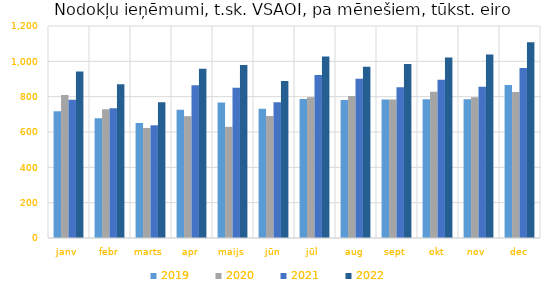
| Category | 2019 | 2020 | 2021 | 2022 |
|---|---|---|---|---|
| janv | 717665.072 | 809688.721 | 782986.001 | 941791.936 |
| febr | 677510.103 | 729172.133 | 734852.065 | 870814.989 |
| marts | 650253.135 | 622803.58 | 637891.51 | 769054.685 |
| apr | 726487.169 | 689512.187 | 864350.424 | 957835.152 |
| maijs | 766741.521 | 629295.897 | 850252.991 | 978678.559 |
| jūn | 731242 | 690672.482 | 768738.388 | 888916.233 |
| jūl | 786636.326 | 796698.852 | 922262.256 | 1027456.888 |
| aug | 780536.674 | 803951.557 | 901674.184 | 969994.081 |
| sept | 784169.124 | 783355.666 | 852725.586 | 985435.904 |
| okt | 785502.085 | 827797.907 | 895873.595 | 1021662.514 |
| nov | 784818.309 | 797101.461 | 856461.1 | 1038227.674 |
| dec | 865773.712 | 826496.37 | 962936.043 | 1107409.079 |